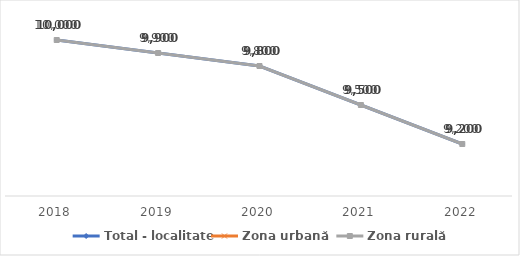
| Category | Total - localitate | Zona urbană   | Zona rurală  |
|---|---|---|---|
| 2018 | 10000 |  | 10000 |
| 2019 | 9900 |  | 9900 |
| 2020 | 9800 |  | 9800 |
| 2021 | 9500 |  | 9500 |
| 2022 | 9200 |  | 9200 |